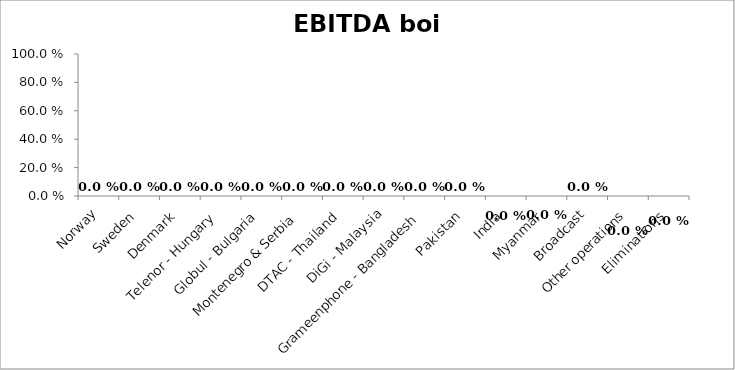
| Category | Series 0 |
|---|---|
| Norway | 0 |
| Sweden | 0 |
| Denmark | 0 |
| Telenor - Hungary | 0 |
| Globul - Bulgaria | 0 |
| Montenegro & Serbia | 0 |
| DTAC - Thailand | 0 |
| DiGi - Malaysia | 0 |
| Grameenphone - Bangladesh | 0 |
| Pakistan | 0 |
| India | 0 |
| Myanmar | 0 |
| Broadcast | 0 |
| Other operations | 0 |
| Eliminations | 0 |